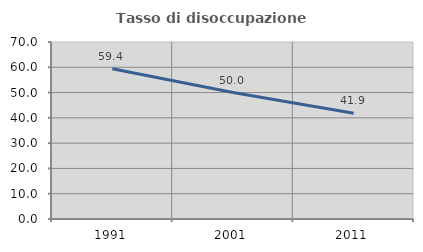
| Category | Tasso di disoccupazione giovanile  |
|---|---|
| 1991.0 | 59.441 |
| 2001.0 | 50 |
| 2011.0 | 41.86 |